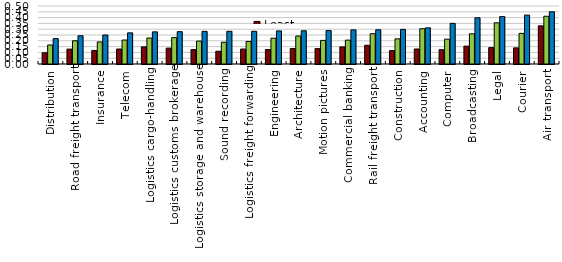
| Category | Least restrictive countries | OECD | Switzerland |
|---|---|---|---|
| Distribution | 0.097 | 0.164 | 0.219 |
| Road freight transport | 0.128 | 0.201 | 0.244 |
| Insurance | 0.117 | 0.19 | 0.25 |
| Telecom | 0.129 | 0.207 | 0.269 |
| Logistics cargo-handling | 0.148 | 0.224 | 0.277 |
| Logistics customs brokerage | 0.137 | 0.228 | 0.279 |
| Logistics storage and warehouse | 0.124 | 0.197 | 0.282 |
| Sound recording | 0.11 | 0.187 | 0.282 |
| Logistics freight forwarding | 0.129 | 0.194 | 0.282 |
| Engineering | 0.124 | 0.222 | 0.285 |
| Architecture | 0.133 | 0.241 | 0.287 |
| Motion pictures | 0.132 | 0.204 | 0.288 |
| Commercial banking | 0.147 | 0.206 | 0.294 |
| Rail freight transport | 0.161 | 0.261 | 0.295 |
| Construction | 0.115 | 0.217 | 0.298 |
| Accounting | 0.129 | 0.304 | 0.312 |
| Computer | 0.123 | 0.214 | 0.35 |
| Broadcasting | 0.154 | 0.26 | 0.399 |
| Legal | 0.141 | 0.355 | 0.409 |
| Courier | 0.139 | 0.264 | 0.422 |
| Air transport | 0.329 | 0.412 | 0.45 |